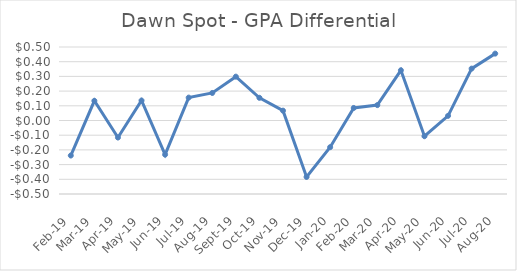
| Category | Dawn Spot - GPA Differential |
|---|---|
| 2019-02-01 | -0.238 |
| 2019-03-01 | 0.134 |
| 2019-04-01 | -0.116 |
| 2019-05-01 | 0.136 |
| 2019-06-01 | -0.232 |
| 2019-07-01 | 0.156 |
| 2019-08-01 | 0.187 |
| 2019-09-01 | 0.298 |
| 2019-10-01 | 0.154 |
| 2019-11-01 | 0.067 |
| 2019-12-01 | -0.384 |
| 2020-01-01 | -0.181 |
| 2020-02-01 | 0.085 |
| 2020-03-01 | 0.105 |
| 2020-04-01 | 0.342 |
| 2020-05-01 | -0.107 |
| 2020-06-01 | 0.032 |
| 2020-07-01 | 0.353 |
| 2020-08-01 | 0.455 |